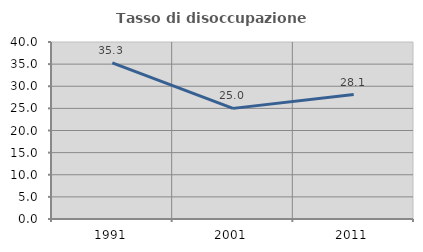
| Category | Tasso di disoccupazione giovanile  |
|---|---|
| 1991.0 | 35.294 |
| 2001.0 | 25 |
| 2011.0 | 28.125 |